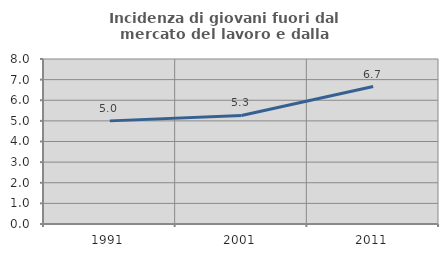
| Category | Incidenza di giovani fuori dal mercato del lavoro e dalla formazione  |
|---|---|
| 1991.0 | 5 |
| 2001.0 | 5.263 |
| 2011.0 | 6.667 |